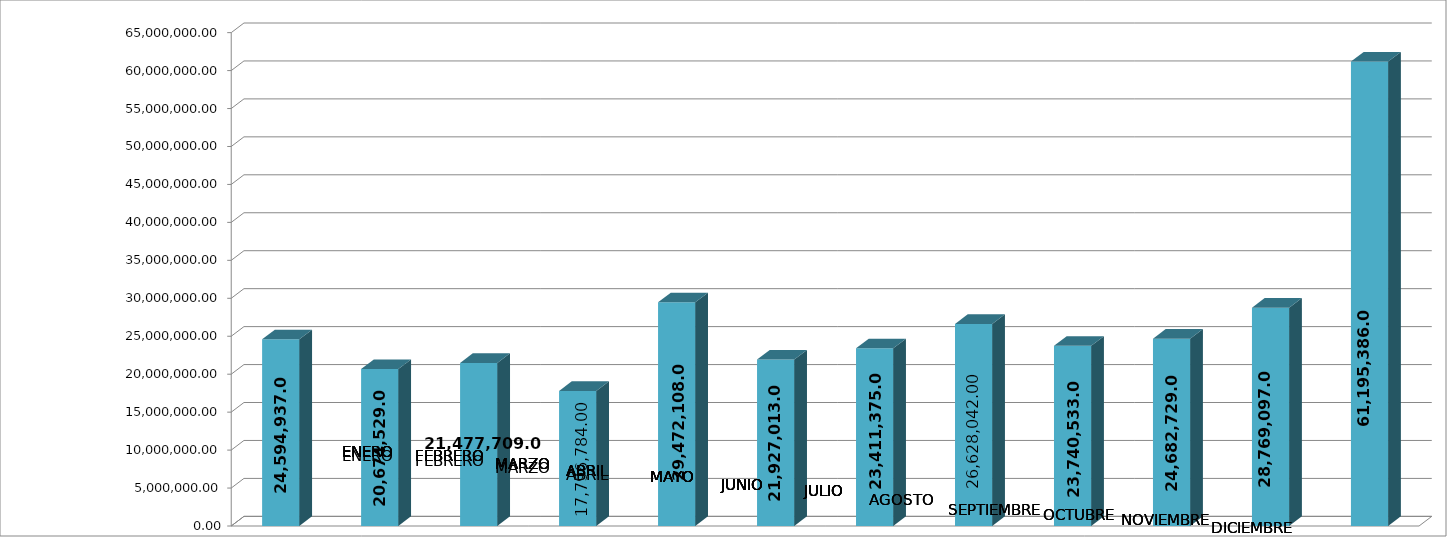
| Category | Series 0 |
|---|---|
| 0 | 24594937 |
| 1 | 20674529 |
| 2 | 21477709 |
| 3 | 17796784 |
| 4 | 29472108 |
| 5 | 21927013 |
| 6 | 23411375 |
| 7 | 26628042 |
| 8 | 23740533 |
| 9 | 24682729 |
| 10 | 28769097 |
| 11 | 61195386 |